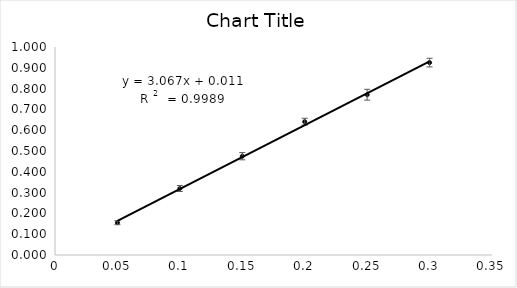
| Category | Series 0 |
|---|---|
| 0.05 | 0.155 |
| 0.1 | 0.32 |
| 0.15 | 0.475 |
| 0.2 | 0.641 |
| 0.25 | 0.771 |
| 0.3 | 0.925 |